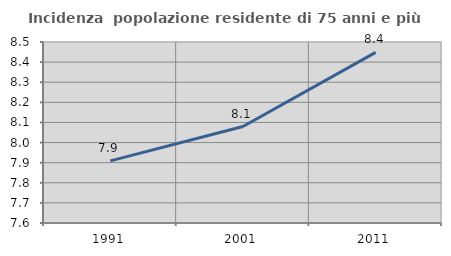
| Category | Incidenza  popolazione residente di 75 anni e più |
|---|---|
| 1991.0 | 7.909 |
| 2001.0 | 8.08 |
| 2011.0 | 8.448 |